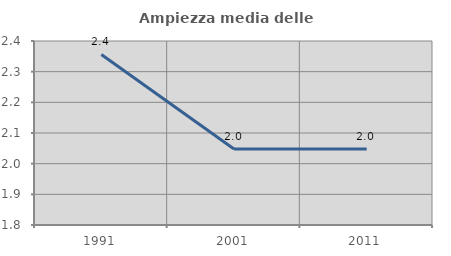
| Category | Ampiezza media delle famiglie |
|---|---|
| 1991.0 | 2.356 |
| 2001.0 | 2.048 |
| 2011.0 | 2.047 |